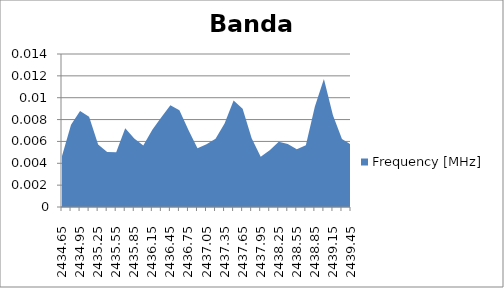
| Category | Frequency [MHz] |
|---|---|
| 2434.65 | 0.005 |
| 2434.8 | 0.008 |
| 2434.95 | 0.009 |
| 2435.1 | 0.008 |
| 2435.25 | 0.006 |
| 2435.4 | 0.005 |
| 2435.55 | 0.005 |
| 2435.7 | 0.007 |
| 2435.85 | 0.006 |
| 2436.0 | 0.006 |
| 2436.15 | 0.007 |
| 2436.3 | 0.008 |
| 2436.45 | 0.009 |
| 2436.6 | 0.009 |
| 2436.75 | 0.007 |
| 2436.9 | 0.005 |
| 2437.05 | 0.006 |
| 2437.2 | 0.006 |
| 2437.35 | 0.008 |
| 2437.5 | 0.01 |
| 2437.65 | 0.009 |
| 2437.8 | 0.006 |
| 2437.95 | 0.005 |
| 2438.1 | 0.005 |
| 2438.25 | 0.006 |
| 2438.4 | 0.006 |
| 2438.55 | 0.005 |
| 2438.7 | 0.006 |
| 2438.85 | 0.009 |
| 2439.0 | 0.012 |
| 2439.15 | 0.008 |
| 2439.3 | 0.006 |
| 2439.45 | 0.006 |